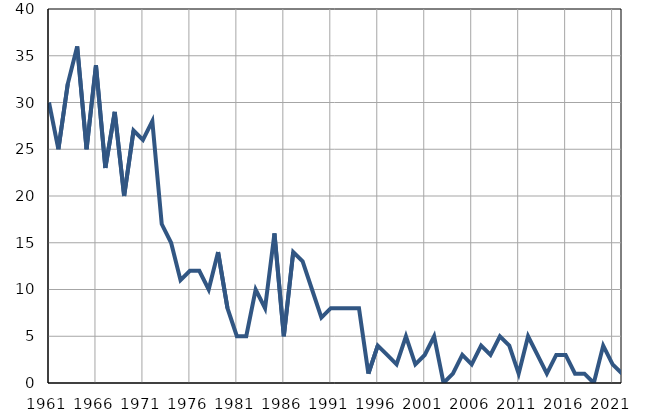
| Category | Умрла 
одојчад |
|---|---|
| 1961.0 | 30 |
| 1962.0 | 25 |
| 1963.0 | 32 |
| 1964.0 | 36 |
| 1965.0 | 25 |
| 1966.0 | 34 |
| 1967.0 | 23 |
| 1968.0 | 29 |
| 1969.0 | 20 |
| 1970.0 | 27 |
| 1971.0 | 26 |
| 1972.0 | 28 |
| 1973.0 | 17 |
| 1974.0 | 15 |
| 1975.0 | 11 |
| 1976.0 | 12 |
| 1977.0 | 12 |
| 1978.0 | 10 |
| 1979.0 | 14 |
| 1980.0 | 8 |
| 1981.0 | 5 |
| 1982.0 | 5 |
| 1983.0 | 10 |
| 1984.0 | 8 |
| 1985.0 | 16 |
| 1986.0 | 5 |
| 1987.0 | 14 |
| 1988.0 | 13 |
| 1989.0 | 10 |
| 1990.0 | 7 |
| 1991.0 | 8 |
| 1992.0 | 8 |
| 1993.0 | 8 |
| 1994.0 | 8 |
| 1995.0 | 1 |
| 1996.0 | 4 |
| 1997.0 | 3 |
| 1998.0 | 2 |
| 1999.0 | 5 |
| 2000.0 | 2 |
| 2001.0 | 3 |
| 2002.0 | 5 |
| 2003.0 | 0 |
| 2004.0 | 1 |
| 2005.0 | 3 |
| 2006.0 | 2 |
| 2007.0 | 4 |
| 2008.0 | 3 |
| 2009.0 | 5 |
| 2010.0 | 4 |
| 2011.0 | 1 |
| 2012.0 | 5 |
| 2013.0 | 3 |
| 2014.0 | 1 |
| 2015.0 | 3 |
| 2016.0 | 3 |
| 2017.0 | 1 |
| 2018.0 | 1 |
| 2019.0 | 0 |
| 2020.0 | 4 |
| 2021.0 | 2 |
| 2022.0 | 1 |